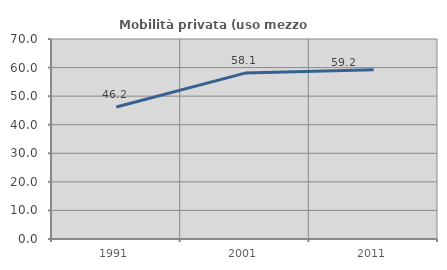
| Category | Mobilità privata (uso mezzo privato) |
|---|---|
| 1991.0 | 46.218 |
| 2001.0 | 58.065 |
| 2011.0 | 59.236 |